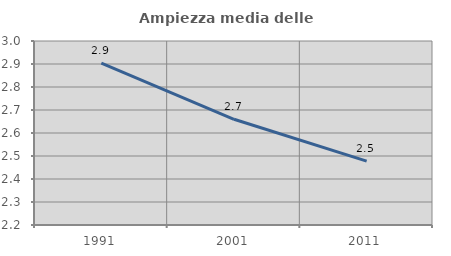
| Category | Ampiezza media delle famiglie |
|---|---|
| 1991.0 | 2.904 |
| 2001.0 | 2.66 |
| 2011.0 | 2.478 |